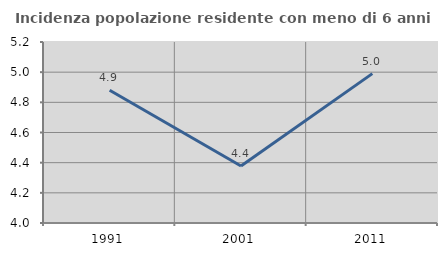
| Category | Incidenza popolazione residente con meno di 6 anni |
|---|---|
| 1991.0 | 4.88 |
| 2001.0 | 4.377 |
| 2011.0 | 4.99 |